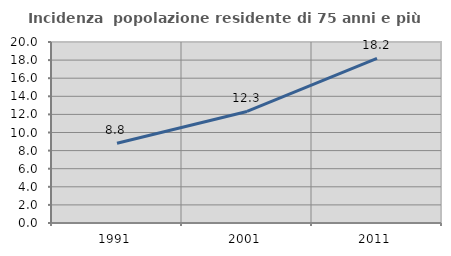
| Category | Incidenza  popolazione residente di 75 anni e più |
|---|---|
| 1991.0 | 8.815 |
| 2001.0 | 12.326 |
| 2011.0 | 18.196 |